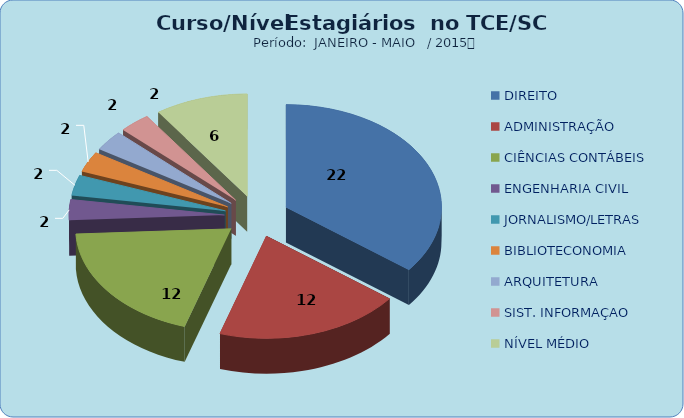
| Category | Series 0 |
|---|---|
| DIREITO | 22 |
| ADMINISTRAÇÃO | 12 |
| CIÊNCIAS CONTÁBEIS | 12 |
| ENGENHARIA CIVIL | 2 |
| JORNALISMO/LETRAS | 2 |
| BIBLIOTECONOMIA | 2 |
| ARQUITETURA | 2 |
| SIST. INFORMAÇAO | 2 |
| NÍVEL MÉDIO | 6 |